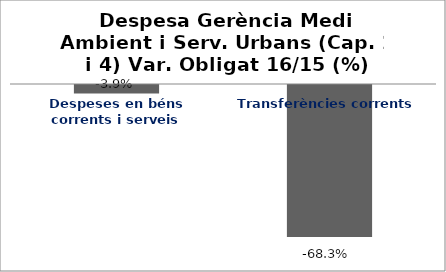
| Category | Series 0 |
|---|---|
| Despeses en béns corrents i serveis | -0.039 |
| Transferències corrents | -0.683 |